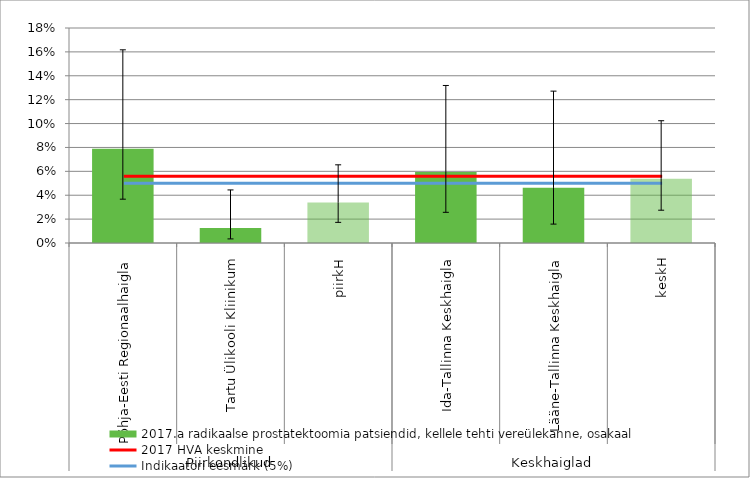
| Category | 2017.a radikaalse prostatektoomia patsiendid, kellele tehti vereülekanne, osakaal |
|---|---|
| 0 | 0.079 |
| 1 | 0.012 |
| 2 | 0.034 |
| 3 | 0.06 |
| 4 | 0.046 |
| 5 | 0.054 |